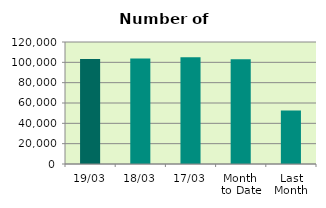
| Category | Series 0 |
|---|---|
| 19/03 | 103290 |
| 18/03 | 103742 |
| 17/03 | 105036 |
| Month 
to Date | 103037 |
| Last
Month | 52501.6 |